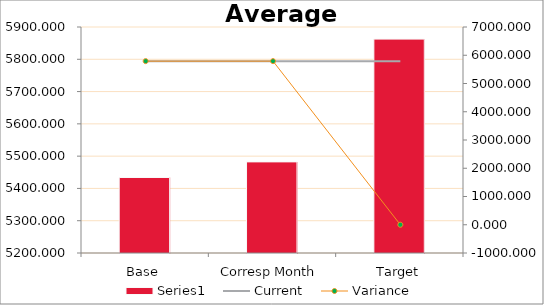
| Category | Series 0 |
|---|---|
| Base | 5433.827 |
| Corresp Month | 5482.24 |
| Target | 5862.533 |